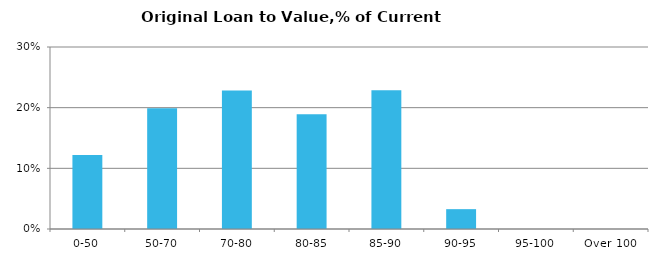
| Category | Series 0 |
|---|---|
| 0-50 | 0.122 |
| 50-70 | 0.199 |
| 70-80 | 0.228 |
| 80-85 | 0.189 |
| 85-90 | 0.229 |
| 90-95 | 0.033 |
| 95-100 | 0 |
| Over 100 | 0 |